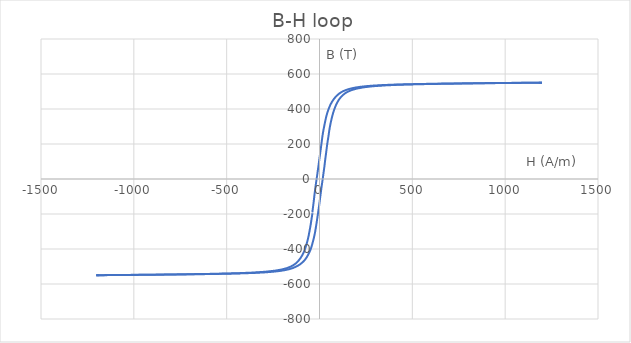
| Category | B-H loop |
|---|---|
| -38.03 | -195.6 |
| -40.15 | -210.5 |
| -42.39 | -225.3 |
| -44.5 | -239.9 |
| -46.6 | -254.5 |
| -48.77 | -268.9 |
| -51.25 | -283.1 |
| -53.67 | -297.1 |
| -56.11 | -311 |
| -58.54 | -324.7 |
| -61.32 | -338.2 |
| -64.36 | -351.6 |
| -67.68 | -364.6 |
| -71.21 | -377.5 |
| -74.87 | -390.1 |
| -78.74 | -402.5 |
| -83.09 | -414.6 |
| -88.23 | -426.4 |
| -94.11 | -438 |
| -100.7 | -449.2 |
| -107.9 | -460.1 |
| -116.2 | -470.7 |
| -126.1 | -480.9 |
| -138.2 | -490.6 |
| -153.5 | -499.9 |
| -173.7 | -508.6 |
| -201.5 | -516.7 |
| -239.6 | -523.8 |
| -290.6 | -529.8 |
| -355.3 | -534.5 |
| -431.9 | -538 |
| -516.0 | -540.5 |
| -602.5 | -542.4 |
| -687.4 | -543.8 |
| -768.3 | -545 |
| -843.7 | -546 |
| -912.5 | -546.8 |
| -974.1 | -547.4 |
| -1028.0 | -548 |
| -1075.0 | -548.5 |
| -1114.0 | -548.9 |
| -1147.0 | -549.2 |
| -1172.0 | -549.4 |
| -1190.0 | -549.6 |
| -1202.0 | -549.7 |
| -1207.0 | -549.7 |
| -1206.0 | -549.7 |
| -1199.0 | -549.7 |
| -1186.0 | -549.6 |
| -1168.0 | -549.5 |
| -1143.0 | -549.3 |
| -1114.0 | -549.1 |
| -1080.0 | -548.8 |
| -1041.0 | -548.5 |
| -996.9 | -548.1 |
| -948.8 | -547.6 |
| -897.3 | -547.1 |
| -842.3 | -546.5 |
| -783.9 | -545.8 |
| -722.5 | -545.1 |
| -658.8 | -544.2 |
| -593.9 | -543.2 |
| -528.7 | -541.9 |
| -464.4 | -540.5 |
| -402.4 | -538.6 |
| -344.7 | -536.4 |
| -293.7 | -533.5 |
| -250.2 | -529.9 |
| -214.4 | -525.7 |
| -185.5 | -520.7 |
| -162.6 | -515.1 |
| -144.2 | -509 |
| -129.1 | -502.4 |
| -116.4 | -495.4 |
| -105.3 | -488 |
| -95.65 | -480.1 |
| -87.16 | -471.9 |
| -79.79 | -463.4 |
| -73.36 | -454.4 |
| -67.69 | -445.1 |
| -62.62 | -435.6 |
| -57.77 | -425.7 |
| -53.11 | -415.4 |
| -48.83 | -404.9 |
| -45.16 | -394.1 |
| -41.97 | -382.9 |
| -38.91 | -371.6 |
| -35.87 | -359.9 |
| -32.98 | -347.9 |
| -30.15 | -335.6 |
| -27.49 | -323.2 |
| -24.98 | -310.5 |
| -22.85 | -297.6 |
| -20.76 | -284.5 |
| -18.73 | -271.1 |
| -16.63 | -257.5 |
| -14.68 | -243.8 |
| -12.75 | -229.9 |
| -10.76 | -215.8 |
| -8.77 | -201.5 |
| -6.72 | -187.1 |
| -4.75 | -172.5 |
| -2.73 | -157.8 |
| -0.92 | -143 |
| 0.91 | -128.1 |
| 2.65 | -113.1 |
| 4.57 | -97.98 |
| 6.42 | -82.82 |
| 8.3 | -67.6 |
| 10.16 | -52.3 |
| 12.17 | -36.96 |
| 14.3 | -21.55 |
| 16.44 | -6.1 |
| 18.46 | 9.4 |
| 20.39 | 24.91 |
| 22.39 | 40.43 |
| 24.45 | 55.95 |
| 26.42 | 71.44 |
| 28.13 | 86.92 |
| 29.83 | 102.3 |
| 31.63 | 117.7 |
| 33.62 | 133.1 |
| 35.52 | 148.3 |
| 37.33 | 163.5 |
| 39.08 | 178.7 |
| 40.93 | 193.7 |
| 42.96 | 208.7 |
| 45.18 | 223.5 |
| 47.37 | 238.3 |
| 49.43 | 252.9 |
| 51.26 | 267.3 |
| 53.27 | 281.6 |
| 55.5 | 295.8 |
| 58.02 | 309.7 |
| 60.73 | 323.5 |
| 63.64 | 337.1 |
| 66.73 | 350.6 |
| 69.85 | 363.7 |
| 73.22 | 376.7 |
| 76.87 | 389.4 |
| 81.02 | 401.8 |
| 85.51 | 414 |
| 90.4 | 425.9 |
| 95.84 | 437.6 |
| 102.0 | 448.9 |
| 109.0 | 459.8 |
| 117.2 | 470.5 |
| 127.0 | 480.7 |
| 139.1 | 490.6 |
| 154.4 | 499.9 |
| 174.5 | 508.7 |
| 201.7 | 516.8 |
| 238.8 | 524.1 |
| 288.9 | 530.2 |
| 352.8 | 534.9 |
| 428.8 | 538.5 |
| 512.3 | 541 |
| 598.6 | 542.9 |
| 683.7 | 544.4 |
| 764.7 | 545.6 |
| 839.7 | 546.6 |
| 907.8 | 547.4 |
| 968.7 | 548.1 |
| 1023.0 | 548.6 |
| 1070.0 | 549.1 |
| 1109.0 | 549.5 |
| 1142.0 | 549.9 |
| 1167.0 | 550.1 |
| 1186.0 | 550.3 |
| 1198.0 | 550.4 |
| 1203.0 | 550.5 |
| 1202.0 | 550.5 |
| 1194.0 | 550.5 |
| 1181.0 | 550.4 |
| 1163.0 | 550.3 |
| 1138.0 | 550.1 |
| 1109.0 | 549.9 |
| 1075.0 | 549.6 |
| 1036.0 | 549.3 |
| 993.3 | 548.9 |
| 945.7 | 548.4 |
| 894.2 | 547.9 |
| 839.0 | 547.3 |
| 780.9 | 546.6 |
| 719.8 | 545.8 |
| 656.3 | 545 |
| 591.4 | 543.9 |
| 526.4 | 542.6 |
| 462.3 | 541.1 |
| 400.8 | 539.3 |
| 343.8 | 536.9 |
| 293.2 | 534 |
| 250.2 | 530.4 |
| 214.9 | 526.1 |
| 186.3 | 521.1 |
| 163.3 | 515.5 |
| 144.7 | 509.4 |
| 129.4 | 502.8 |
| 116.9 | 495.8 |
| 106.6 | 488.4 |
| 97.74 | 480.5 |
| 89.72 | 472.3 |
| 82.41 | 463.8 |
| 75.88 | 454.9 |
| 69.98 | 445.6 |
| 64.59 | 436 |
| 59.58 | 426.1 |
| 55.13 | 415.9 |
| 51.05 | 405.4 |
| 47.22 | 394.6 |
| 43.62 | 383.5 |
| 40.36 | 372.2 |
| 37.43 | 360.5 |
| 34.68 | 348.6 |
| 32.06 | 336.4 |
| 29.62 | 324 |
| 27.2 | 311.3 |
| 24.79 | 298.5 |
| 22.3 | 285.4 |
| 19.99 | 272.1 |
| 17.86 | 258.6 |
| 15.89 | 244.9 |
| 14.09 | 231 |
| 12.34 | 217 |
| 10.7 | 202.9 |
| 8.9 | 188.5 |
| 7.13 | 174 |
| 5.24 | 159.3 |
| 3.32 | 144.6 |
| 1.27 | 129.7 |
| -0.63 | 114.8 |
| -2.46 | 99.74 |
| -4.28 | 84.61 |
| -6.28 | 69.42 |
| -8.31 | 54.19 |
| -10.27 | 38.9 |
| -12.24 | 23.54 |
| -14.34 | 8.13 |
| -16.6 | -7.35 |
| -18.75 | -22.85 |
| -20.79 | -38.35 |
| -22.65 | -53.84 |
| -24.62 | -69.32 |
| -26.41 | -84.73 |
| -28.11 | -100.1 |
| -29.69 | -115.4 |
| -31.37 | -130.7 |
| -33.17 | -145.9 |
| -37.11 | -179.1 |
| -37.28 | -180.6 |
| -37.45 | -182.1 |
| -37.62 | -183.6 |
| -37.78 | -185.1 |
| -37.95 | -186.6 |
| -38.11 | -188.1 |
| -38.27 | -189.6 |
| -38.44 | -191.1 |